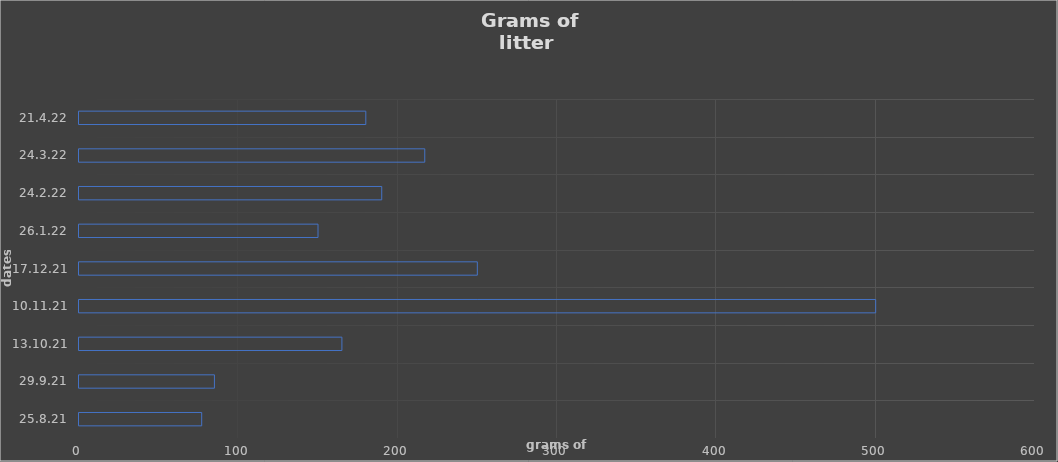
| Category | Series 0 |
|---|---|
| 25.8.21 | 77 |
| 29.9.21 | 85 |
| 13.10.21 | 165 |
| 10.11.21 | 500 |
| 17.12.21 | 250 |
| 26.1.22 | 150 |
| 24.2.22 | 190 |
| 24.3.22 | 217 |
| 21.4.22 | 180 |